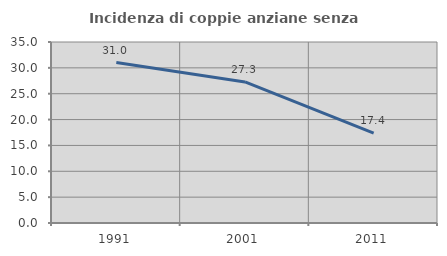
| Category | Incidenza di coppie anziane senza figli  |
|---|---|
| 1991.0 | 31.034 |
| 2001.0 | 27.273 |
| 2011.0 | 17.391 |